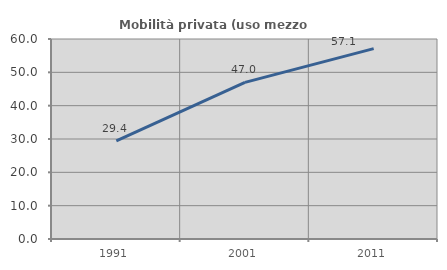
| Category | Mobilità privata (uso mezzo privato) |
|---|---|
| 1991.0 | 29.418 |
| 2001.0 | 46.99 |
| 2011.0 | 57.118 |